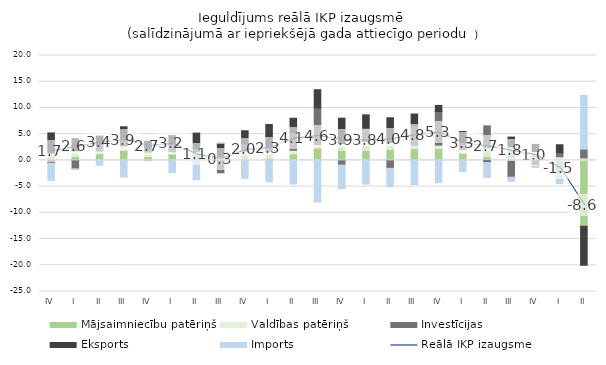
| Category | Mājsaimniecību patēriņš | Valdības patēriņš | Investīcijas | Eksports | Imports |
|---|---|---|---|---|---|
| IV | 0.942 | 0.469 | -0.534 | 3.827 | -3.274 |
| I | 1.316 | 0.527 | -1.596 | 2.289 | -0.131 |
| II | 1.246 | 0.551 | 1.228 | 1.605 | -0.938 |
| III | 2.174 | 0.558 | 1.526 | 2.151 | -3.165 |
| IV | 1.125 | 0.451 | 0.706 | 1.508 | 0.022 |
| I | 1.207 | 0.443 | 1.396 | 1.68 | -2.299 |
| II | 1.183 | 0.447 | 0.625 | 2.949 | -3.679 |
| III | 0.131 | 0.513 | -2.366 | 2.612 | 0.004 |
| IV | 1.059 | 0.664 | 1.409 | 2.519 | -3.439 |
| I | 1.105 | 0.652 | 0.951 | 4.132 | -4.091 |
| II | 1.233 | 0.706 | 3.388 | 2.705 | -4.48 |
| III | 2.331 | 0.711 | 6.952 | 3.486 | -7.949 |
| IV | 2.567 | 0.656 | -0.894 | 4.826 | -4.498 |
| I | 2.83 | 0.723 | 2.646 | 2.484 | -4.509 |
| II | 2.727 | 0.702 | -1.513 | 4.696 | -3.486 |
| III | 2.231 | 0.668 | 3.694 | 2.248 | -4.602 |
| IV | 2.263 | 0.654 | 6.401 | 1.162 | -4.246 |
| I | 1.528 | 0.553 | 1.425 | 1.994 | -2.135 |
| II | 1.937 | 0.521 | 4.135 | -0.348 | -2.915 |
| III | 2.06 | 0.502 | -3.202 | 1.886 | -0.796 |
| IV | 1.207 | 0.473 | -0.973 | 1.357 | -0.391 |
| I | -2.276 | 0.487 | 0.971 | 1.523 | -2.175 |
| II | -12.561 | 0.462 | 1.676 | -7.435 | 10.259 |